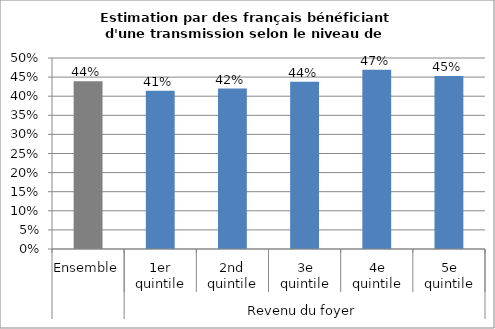
| Category | Estimation par des français bénéficiant d'une transmission |
|---|---|
| 0 | 0.439 |
| 1 | 0.414 |
| 2 | 0.42 |
| 3 | 0.438 |
| 4 | 0.469 |
| 5 | 0.453 |